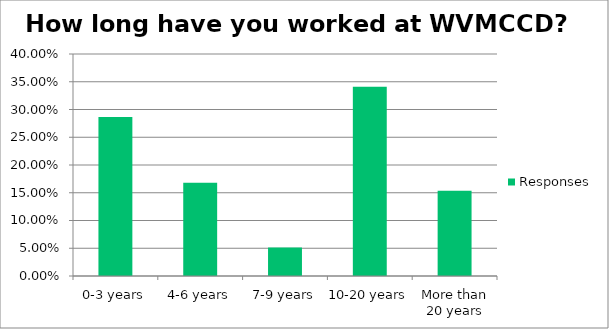
| Category | Responses |
|---|---|
| 0-3 years | 0.286 |
| 4-6 years | 0.168 |
| 7-9 years | 0.051 |
| 10-20 years | 0.341 |
| More than 20 years | 0.154 |